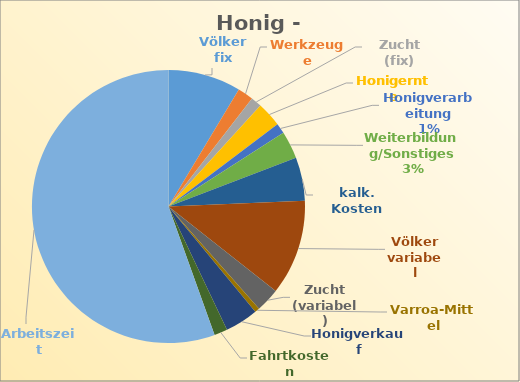
| Category | Series 0 |
|---|---|
| Völker fix | 0.699 |
| Werkzeuge | 0.151 |
| Zucht (fix) | 0.104 |
| Honigernte | 0.24 |
| Honigverarbeitung | 0.098 |
| Weiterbildung/Sonstiges | 0.264 |
| kalk. Kosten | 0.419 |
| Völker variabel | 0.916 |
| Zucht (variabel) | 0.23 |
| Varroa-Mittel | 0.046 |
| Honigverkauf | 0.318 |
| Fahrtkosten | 0.127 |
| Arbeitszeit | 4.5 |